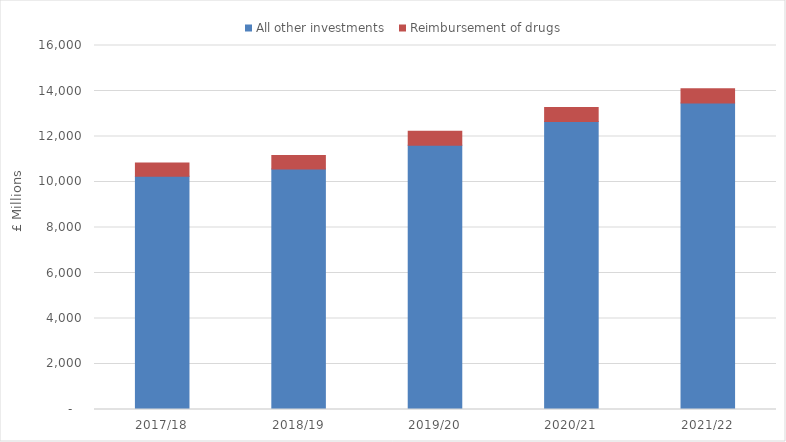
| Category | All other investments  | Reimbursement of drugs |
|---|---|---|
| 2017/18 | 10255.333 | 576.368 |
| 2018/19 | 10569.538 | 592.976 |
| 2019/20 | 11615.055 | 617.078 |
| 2020/21 | 12661.23 | 614.711 |
| 2021/22 | 13471.13 | 625.069 |